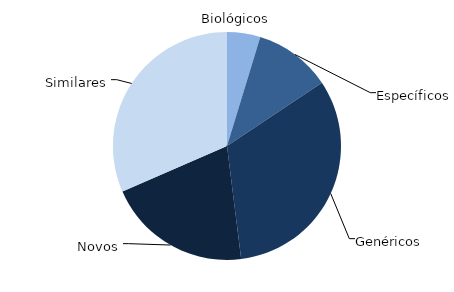
| Category | Series 0 |
|---|---|
| Biológicos | 213233066.439 |
| Específicos | 494527719.933 |
| Genéricos | 1464433375.409 |
| Novos | 925714867.517 |
| Similares | 1426031757.333 |